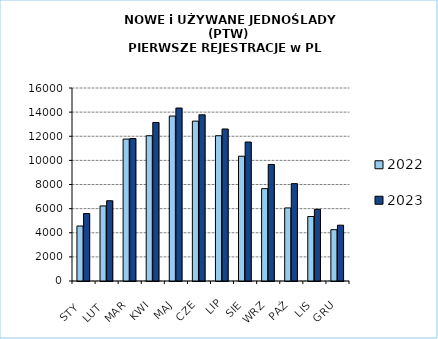
| Category | 2022 | 2023 |
|---|---|---|
|  STY  | 4557 | 5592 |
|  LUT  | 6222 | 6653 |
| MAR | 11764 | 11811 |
| KWI | 12045 | 13142 |
| MAJ | 13675 | 14339 |
| CZE | 13254 | 13778 |
| LIP | 12043 | 12602 |
| SIE | 10344 | 11523 |
| WRZ | 7657 | 9663 |
| PAŹ | 6059 | 8072 |
| LIS | 5346 | 5944 |
| GRU | 4253 | 4628 |